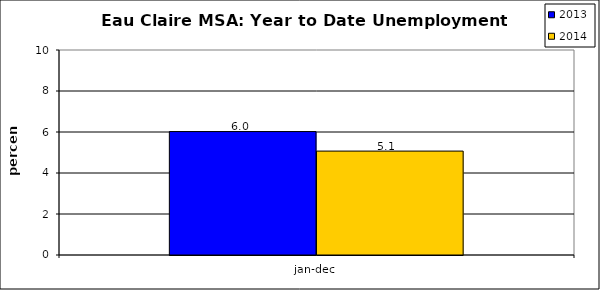
| Category | 2013 | 2014 |
|---|---|---|
| 0 | 6.022 | 5.069 |